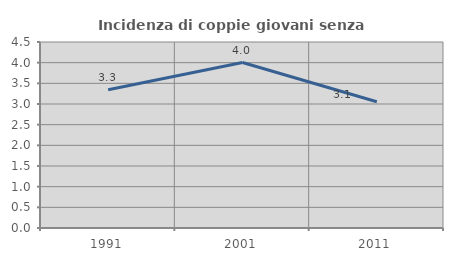
| Category | Incidenza di coppie giovani senza figli |
|---|---|
| 1991.0 | 3.346 |
| 2001.0 | 4.004 |
| 2011.0 | 3.054 |